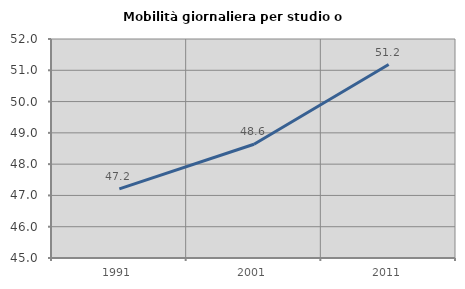
| Category | Mobilità giornaliera per studio o lavoro |
|---|---|
| 1991.0 | 47.211 |
| 2001.0 | 48.636 |
| 2011.0 | 51.184 |